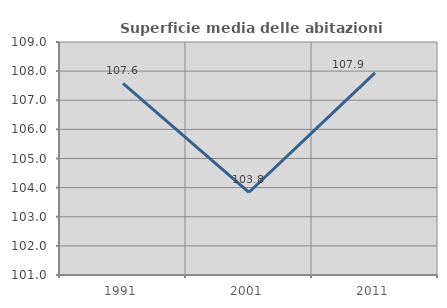
| Category | Superficie media delle abitazioni occupate |
|---|---|
| 1991.0 | 107.579 |
| 2001.0 | 103.84 |
| 2011.0 | 107.942 |